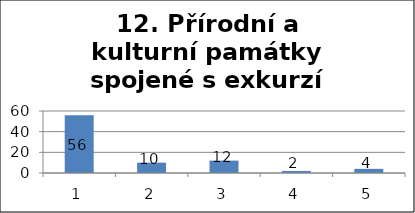
| Category | Series 1 |
|---|---|
| 0 | 56 |
| 1 | 10 |
| 2 | 12 |
| 3 | 2 |
| 4 | 4 |